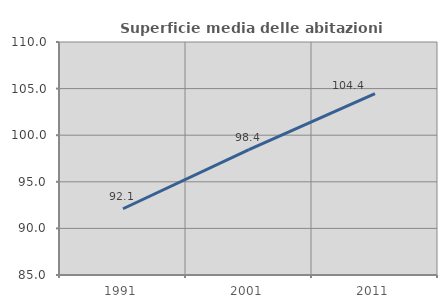
| Category | Superficie media delle abitazioni occupate |
|---|---|
| 1991.0 | 92.109 |
| 2001.0 | 98.448 |
| 2011.0 | 104.45 |